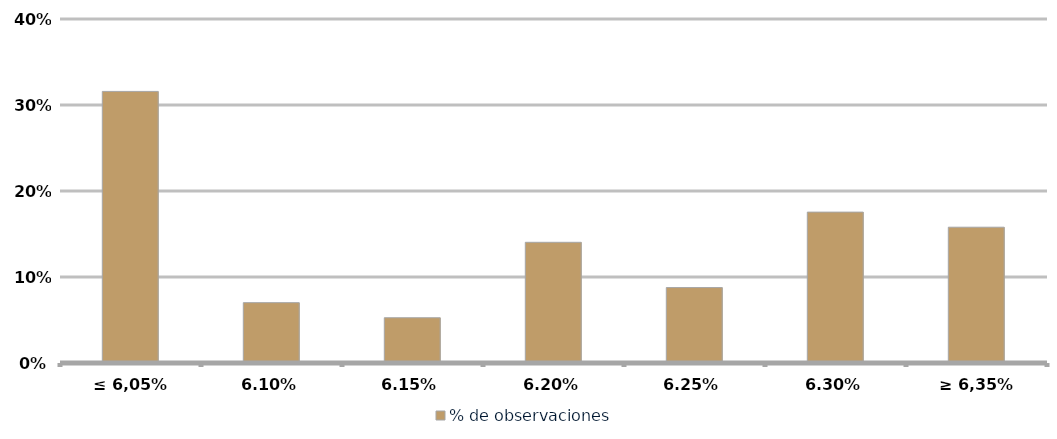
| Category | % de observaciones  |
|---|---|
| ≤ 6,05% | 0.316 |
| 6,10% | 0.07 |
| 6,15% | 0.053 |
| 6,20% | 0.14 |
| 6,25% | 0.088 |
| 6,30% | 0.175 |
| ≥ 6,35% | 0.158 |